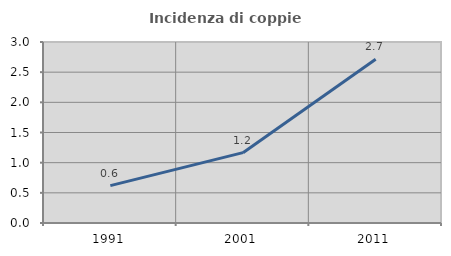
| Category | Incidenza di coppie miste |
|---|---|
| 1991.0 | 0.619 |
| 2001.0 | 1.166 |
| 2011.0 | 2.714 |